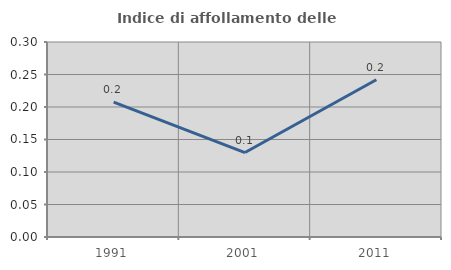
| Category | Indice di affollamento delle abitazioni  |
|---|---|
| 1991.0 | 0.208 |
| 2001.0 | 0.13 |
| 2011.0 | 0.242 |